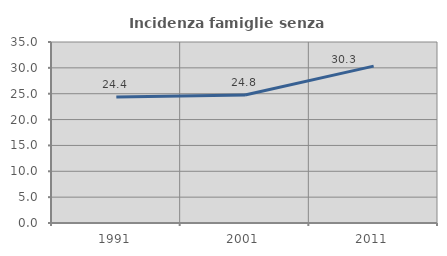
| Category | Incidenza famiglie senza nuclei |
|---|---|
| 1991.0 | 24.364 |
| 2001.0 | 24.76 |
| 2011.0 | 30.331 |